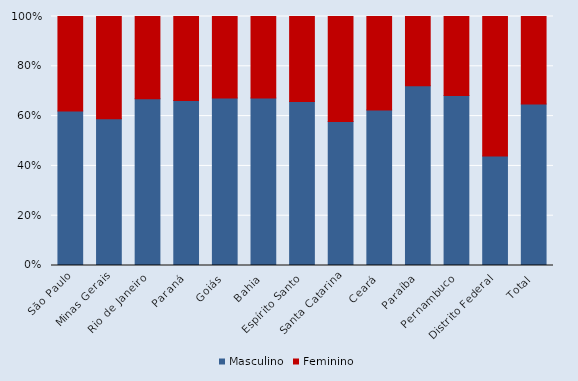
| Category | Masculino | Feminino |
|---|---|---|
| São Paulo | 62 | 38 |
| Minas Gerais | 58.9 | 41.1 |
| Rio de Janeiro | 67 | 33 |
| Paraná | 66.3 | 33.7 |
| Goiás | 67.3 | 32.7 |
| Bahia | 67.3 | 32.7 |
| Espírito Santo | 65.9 | 34.1 |
| Santa Catarina | 57.8 | 42.2 |
| Ceará | 62.4 | 37.6 |
| Paraíba | 72.2 | 27.8 |
| Pernambuco | 68.3 | 31.7 |
| Distrito Federal | 44 | 56 |
| Total | 64.9 | 35.1 |